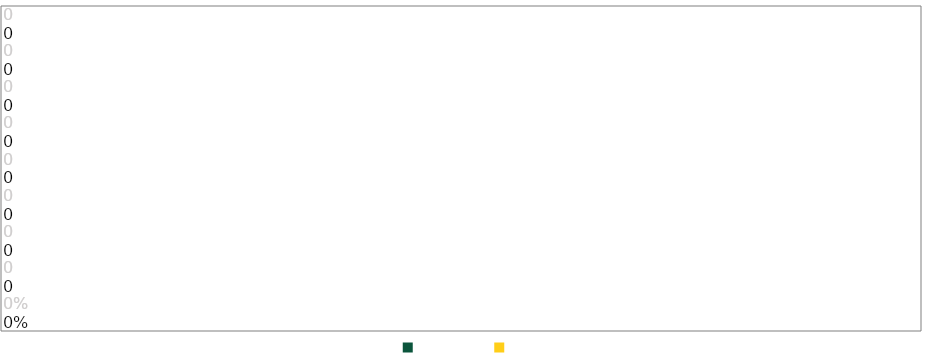
| Category | Series 0 | Series 1 |
|---|---|---|
| PTs | 0 | 0 |
| J | 0 | 0 |
| V | 0 | 0 |
| E | 0 | 0 |
| D | 0 | 0 |
| GP | 0 | 0 |
| GC | 0 | 0 |
| SG | 0 | 0 |
| % | 0 | 0 |